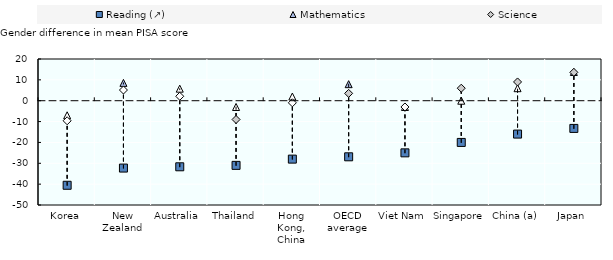
| Category | Reading (↗) | Mathematics | Science |
|---|---|---|---|
| Korea | -40.54 | -6.99 | -9.618 |
| New Zealand | -32.294 | 8.549 | 5.125 |
| Australia | -31.68 | 5.776 | 2.128 |
| Thailand | -31 | -3 | -9 |
| Hong Kong, China | -28 | 2 | -1 |
| OECD average | -26.895 | 7.938 | 3.518 |
| Viet Nam | -25 | -3 | -3 |
| Singapore | -20 | 0 | 6 |
| China (a) | -16 | 6 | 9 |
| Japan | -13.281 | 13.771 | 13.609 |